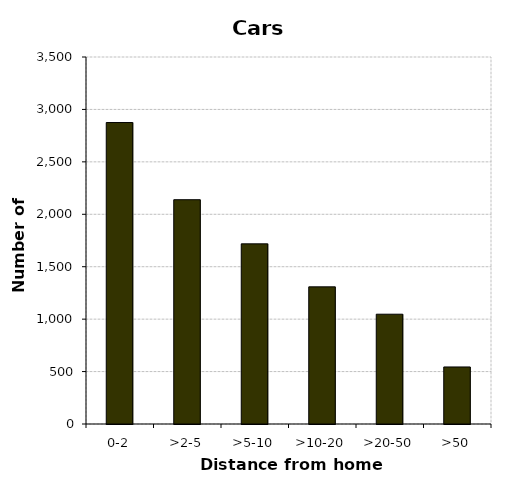
| Category | Cars |
|---|---|
| 0-2 | 2875 |
| >2-5 | 2139 |
| >5-10 | 1718 |
| >10-20 | 1308 |
| >20-50 | 1047 |
| >50 | 544 |